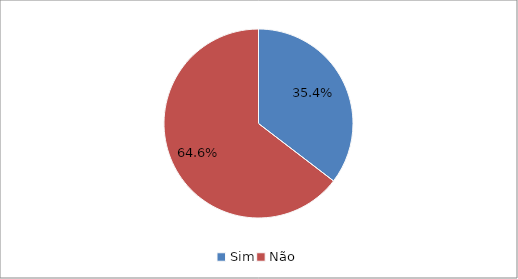
| Category | Series 0 |
|---|---|
| Sim | 0.354 |
| Não | 0.646 |